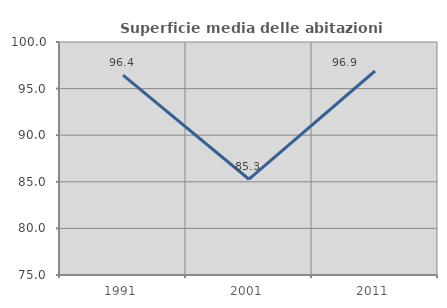
| Category | Superficie media delle abitazioni occupate |
|---|---|
| 1991.0 | 96.439 |
| 2001.0 | 85.276 |
| 2011.0 | 96.889 |